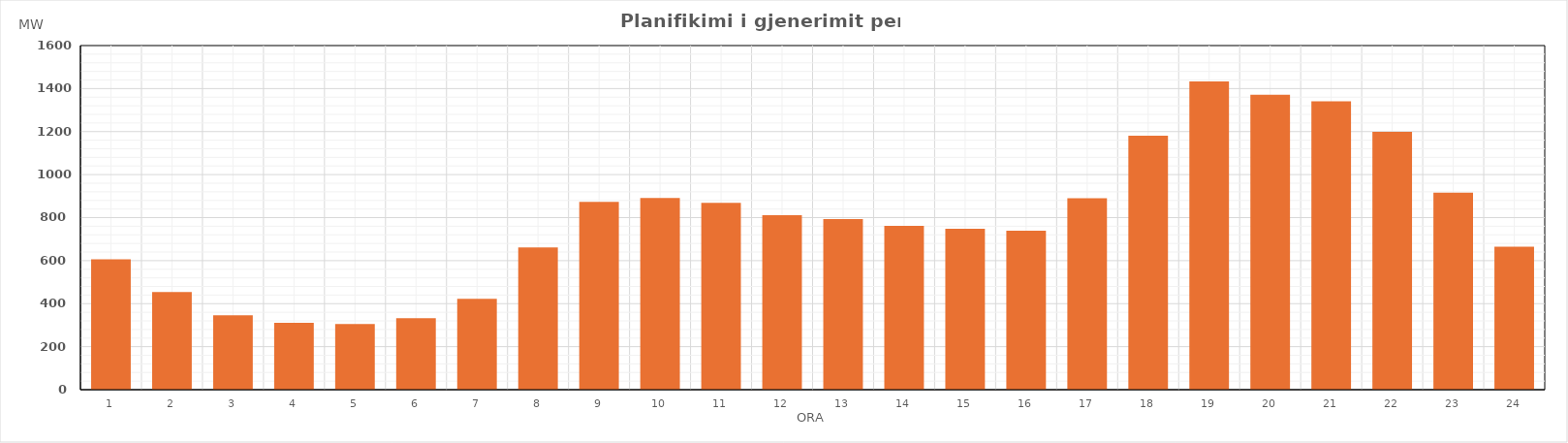
| Category | Max (MW) |
|---|---|
| 0 | 605.64 |
| 1 | 453.66 |
| 2 | 345.61 |
| 3 | 311.39 |
| 4 | 305.43 |
| 5 | 332.43 |
| 6 | 422.85 |
| 7 | 661.89 |
| 8 | 872.83 |
| 9 | 891.44 |
| 10 | 869.14 |
| 11 | 811.06 |
| 12 | 793.46 |
| 13 | 762.12 |
| 14 | 747.65 |
| 15 | 739.69 |
| 16 | 889.58 |
| 17 | 1181.38 |
| 18 | 1433.57 |
| 19 | 1370.89 |
| 20 | 1340.29 |
| 21 | 1199.42 |
| 22 | 916.12 |
| 23 | 664.26 |